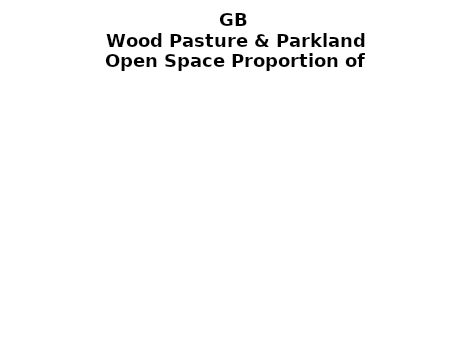
| Category | Wood Pasture & Parkland |
|---|---|
|  ≥ 10ha, < 10%  | 0.178 |
|   ≥ 10ha, 10-25% | 0.06 |
|   ≥ 10ha, > 25 and <50%  | 0.062 |
|   ≥ 10ha, ≥ 50%  | 0.275 |
|  < 10ha, < 10% | 0.001 |
|  < 10ha, 10-25% | 0.012 |
|  < 10ha, > 25 and < 50% | 0.056 |
|  < 10ha, ≥ 50% | 0.356 |